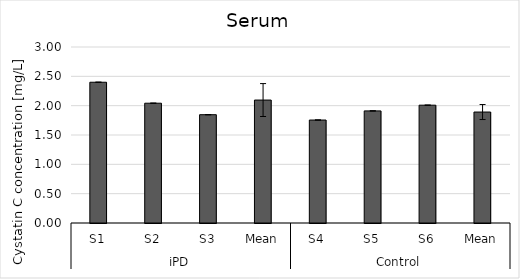
| Category | Series 0 |
|---|---|
| 0 | 2.399 |
| 1 | 2.042 |
| 2 | 1.846 |
| 3 | 2.096 |
| 4 | 1.755 |
| 5 | 1.911 |
| 6 | 2.008 |
| 7 | 1.891 |